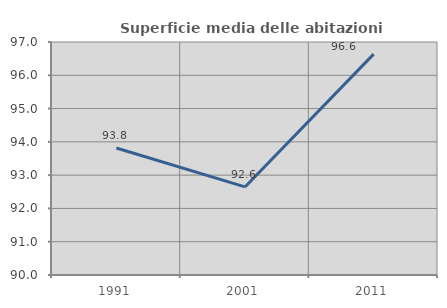
| Category | Superficie media delle abitazioni occupate |
|---|---|
| 1991.0 | 93.816 |
| 2001.0 | 92.646 |
| 2011.0 | 96.637 |